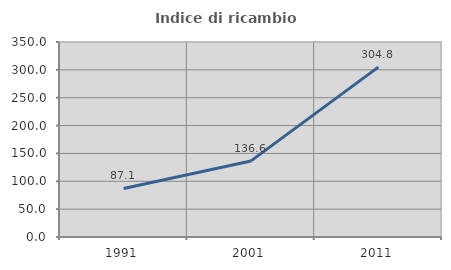
| Category | Indice di ricambio occupazionale  |
|---|---|
| 1991.0 | 87.112 |
| 2001.0 | 136.566 |
| 2011.0 | 304.83 |